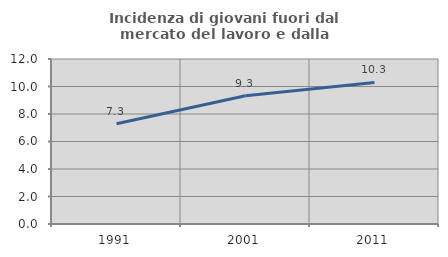
| Category | Incidenza di giovani fuori dal mercato del lavoro e dalla formazione  |
|---|---|
| 1991.0 | 7.292 |
| 2001.0 | 9.333 |
| 2011.0 | 10.294 |